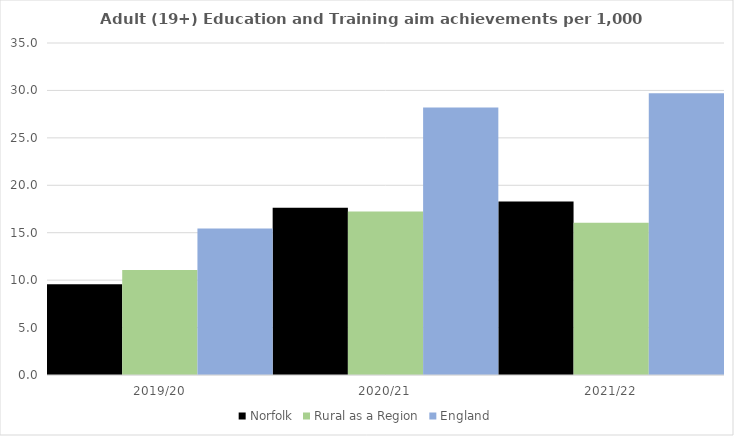
| Category | Norfolk | Rural as a Region | England |
|---|---|---|---|
| 2019/20 | 9.563 | 11.081 | 15.446 |
| 2020/21 | 17.629 | 17.224 | 28.211 |
| 2021/22 | 18.3 | 16.063 | 29.711 |